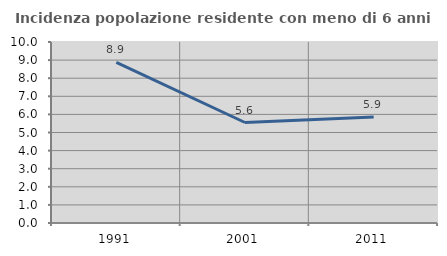
| Category | Incidenza popolazione residente con meno di 6 anni |
|---|---|
| 1991.0 | 8.871 |
| 2001.0 | 5.552 |
| 2011.0 | 5.86 |